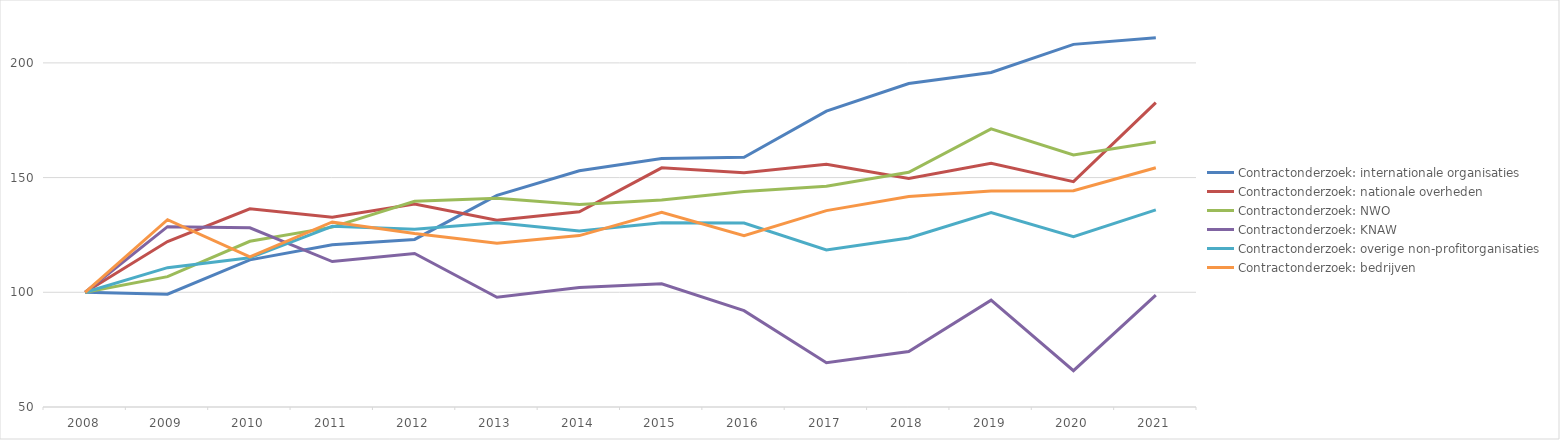
| Category | Contractonderzoek: internationale organisaties  | Contractonderzoek: nationale overheden | Contractonderzoek: NWO | Contractonderzoek: KNAW | Contractonderzoek: overige non-profitorganisaties | Contractonderzoek: bedrijven |
|---|---|---|---|---|---|---|
| 2008.0 | 100 | 100 | 100 | 100 | 100 | 100 |
| 2009.0 | 99.189 | 122.144 | 106.817 | 128.598 | 110.731 | 131.63 |
| 2010.0 | 114.149 | 136.372 | 122.232 | 128.13 | 115.008 | 115.482 |
| 2011.0 | 120.732 | 132.753 | 128.402 | 113.399 | 128.759 | 130.673 |
| 2012.0 | 123.039 | 138.484 | 139.707 | 116.942 | 127.459 | 125.593 |
| 2013.0 | 142.22 | 131.403 | 141.031 | 97.83 | 130.305 | 121.413 |
| 2014.0 | 152.96 | 135.095 | 138.266 | 102.038 | 126.706 | 124.712 |
| 2015.0 | 158.279 | 154.264 | 140.232 | 103.727 | 130.325 | 134.846 |
| 2016.0 | 158.86 | 152.108 | 143.909 | 91.981 | 130.207 | 124.638 |
| 2017.0 | 178.967 | 155.848 | 146.24 | 69.322 | 118.493 | 135.598 |
| 2018.0 | 191.019 | 149.662 | 152.304 | 74.183 | 123.704 | 141.741 |
| 2019.0 | 195.808 | 156.188 | 171.207 | 96.584 | 134.785 | 144.121 |
| 2020.0 | 208.076 | 148.256 | 159.854 | 65.851 | 124.24 | 144.286 |
| 2021.0 | 210.917 | 182.646 | 165.54 | 98.801 | 135.93 | 154.284 |